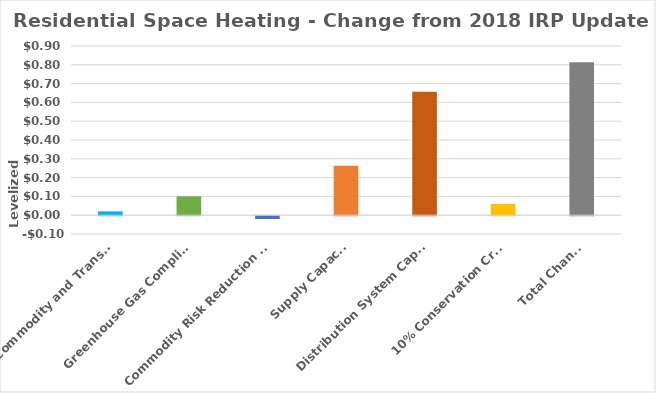
| Category | Residential Space Heating  |
|---|---|
|  Commodity and Transport | 0.02 |
| Greenhouse Gas Compliance | 0.101 |
| Commodity Risk Reduction Cost | -0.015 |
| Supply Capacity | 0.262 |
| Distribution System Capacity | 0.657 |
| 10% Conservation Credit | 0.06 |
| Total Change | 0.814 |